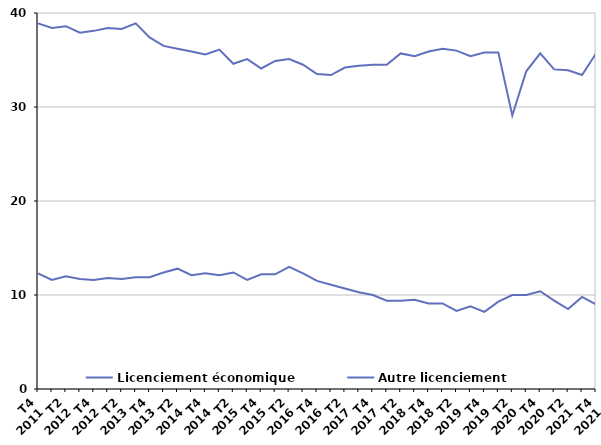
| Category | Licenciement économique | Autre licenciement |
|---|---|---|
| T4
2011 | 12.3 | 38.9 |
| T1
2012 | 11.6 | 38.4 |
| T2
2012 | 12 | 38.6 |
| T3
2012 | 11.7 | 37.9 |
| T4
2012 | 11.6 | 38.1 |
| T1
2013 | 11.8 | 38.4 |
| T2
2013 | 11.7 | 38.3 |
| T3
2013 | 11.9 | 38.9 |
| T4
2013 | 11.9 | 37.4 |
| T1
2014 | 12.4 | 36.5 |
| T2
2014 | 12.8 | 36.2 |
| T3
2014 | 12.1 | 35.9 |
| T4
2014 | 12.3 | 35.6 |
| T1
2015 | 12.1 | 36.1 |
| T2
2015 | 12.4 | 34.6 |
| T3
2015 | 11.6 | 35.1 |
| T4
2015 | 12.2 | 34.1 |
| T1
2016 | 12.2 | 34.9 |
| T2
2016 | 13 | 35.1 |
| T3
2016 | 12.3 | 34.5 |
| T4
2016 | 11.5 | 33.5 |
| T1
2017 | 11.1 | 33.4 |
| T2
2017 | 10.7 | 34.2 |
| T3
2017 | 10.3 | 34.4 |
| T4
2017 | 10 | 34.5 |
| T1
2018 | 9.4 | 34.5 |
| T2
2018 | 9.4 | 35.7 |
| T3
2018 | 9.5 | 35.4 |
| T4
2018 | 9.1 | 35.9 |
| T1
2019 | 9.1 | 36.2 |
| T2
2019 | 8.3 | 36 |
| T3
2019 | 8.8 | 35.4 |
| T4
2019 | 8.2 | 35.8 |
| T1
2020 | 9.3 | 35.8 |
| T2
2020 | 10 | 29.1 |
| T3
2020 | 10 | 33.8 |
| T4
2020 | 10.4 | 35.7 |
| T1
2021 | 9.4 | 34 |
| T2
2021 | 8.5 | 33.9 |
| T3
2021 | 9.8 | 33.4 |
| T4
2021 | 9 | 35.7 |